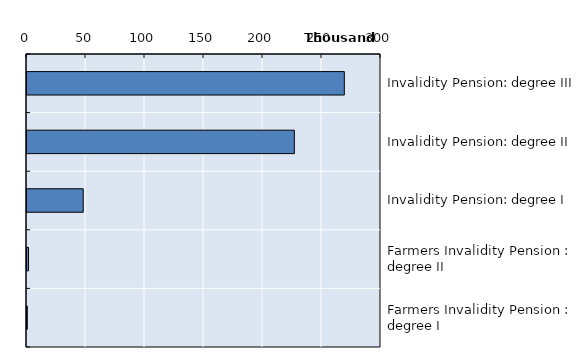
| Category | Series 0 |
|---|---|
| Invalidity Pension: degree III | 268922 |
| Invalidity Pension: degree II | 226586 |
| Invalidity Pension: degree I | 47651 |
| Farmers Invalidity Pension : degree II | 1315 |
| Farmers Invalidity Pension : degree I | 237 |